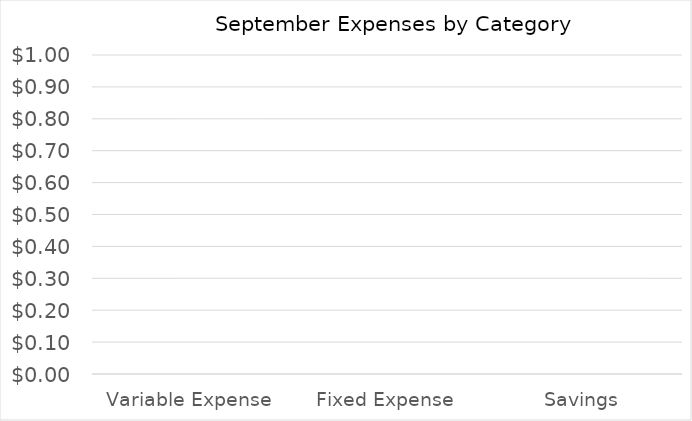
| Category | Series 0 |
|---|---|
| Variable Expense | 0 |
| Fixed Expense | 0 |
| Savings | 0 |